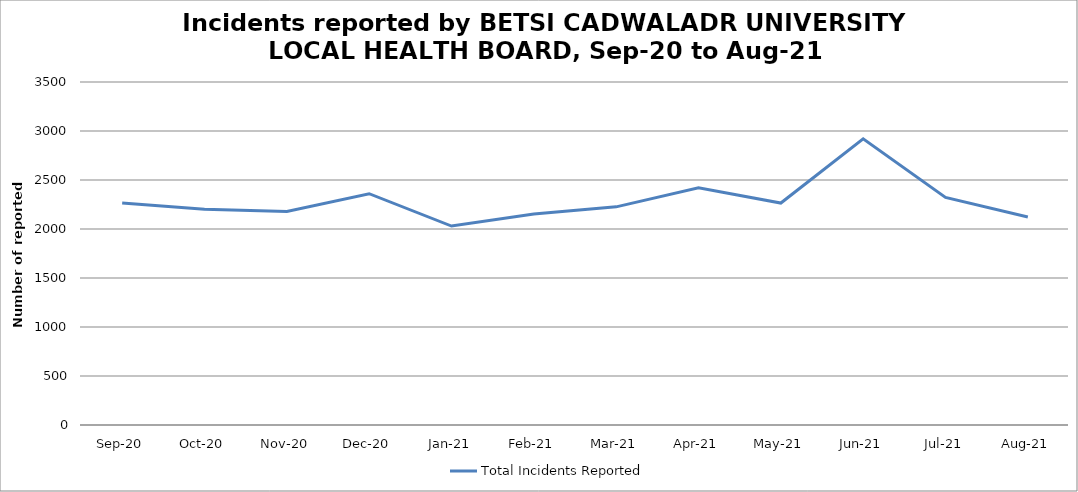
| Category | Total Incidents Reported |
|---|---|
| Sep-20 | 2265 |
| Oct-20 | 2202 |
| Nov-20 | 2178 |
| Dec-20 | 2360 |
| Jan-21 | 2030 |
| Feb-21 | 2152 |
| Mar-21 | 2226 |
| Apr-21 | 2420 |
| May-21 | 2265 |
| Jun-21 | 2920 |
| Jul-21 | 2322 |
| Aug-21 | 2123 |